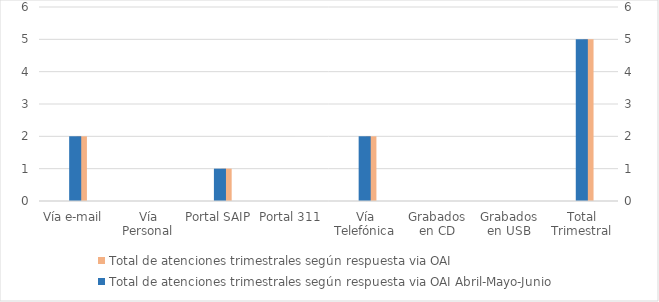
| Category | Total de atenciones trimestrales según respuesta via OAI | Series 2 | Series 4 |
|---|---|---|---|
| Vía e-mail | 2 |  |  |
| Vía Personal | 0 |  |  |
| Portal SAIP | 1 |  |  |
| Portal 311 | 0 |  |  |
| Vía Telefónica | 2 |  |  |
| Grabados en CD | 0 |  |  |
| Grabados en USB | 0 |  |  |
| Total Trimestral | 5 |  |  |